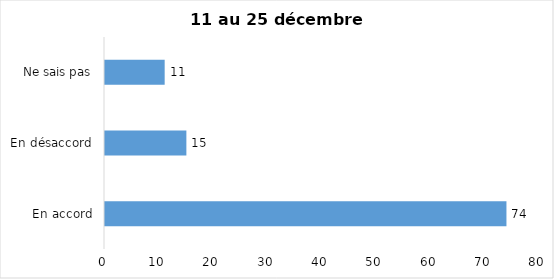
| Category | Series 0 |
|---|---|
| En accord | 74 |
| En désaccord | 15 |
| Ne sais pas | 11 |